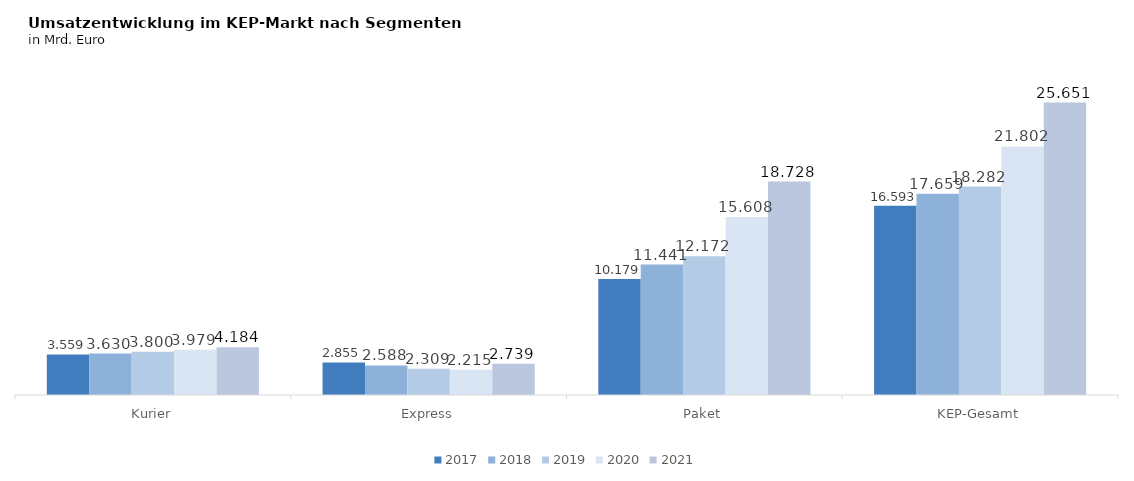
| Category | 2017 | 2018 | 2019 | 2020 | 2021 |
|---|---|---|---|---|---|
| Kurier | 3.559 | 3.63 | 3.8 | 3.979 | 4.184 |
| Express | 2.855 | 2.588 | 2.309 | 2.215 | 2.739 |
| Paket | 10.179 | 11.441 | 12.172 | 15.608 | 18.728 |
| KEP-Gesamt | 16.593 | 17.659 | 18.282 | 21.802 | 25.651 |